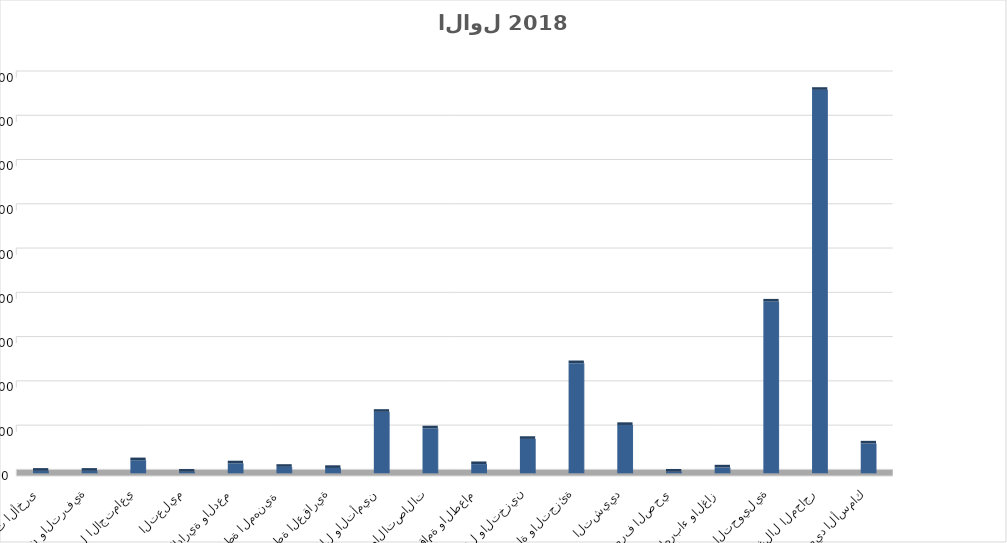
| Category | Series 0 |
|---|---|
| الزراعة والحراجة وصيد الأسماك | 13481601402 |
| التعدين واستغلال المحاجر | 173262850355 |
| الصناعة التحويلية | 77608902848 |
| توصيل الكهرباء والغاز  | 2655243259 |
| امدادات الماء والصرف الصحي | 751598004 |
| التشييد | 21850501206 |
| تجارة الجملة والتجزئة | 49771555506 |
| النقل والتخزين | 15551017602 |
| الإقامة والطعام | 4165548038 |
| المعلومات والاتصالات | 20318161709 |
| أنشطة المال والتأمين | 27786600047 |
| الأنشطة العقارية | 2429889108 |
| الأنشطة المهنية  | 2930391767 |
| الخدمات الإدارية والدعم | 4502625094 |
| التعليم | 742823928 |
| الصحة والعمل الاجتماعي | 5919552355 |
| الفنون والترفية | 1160548459 |
| الخدمات الأخرى | 1159820837 |